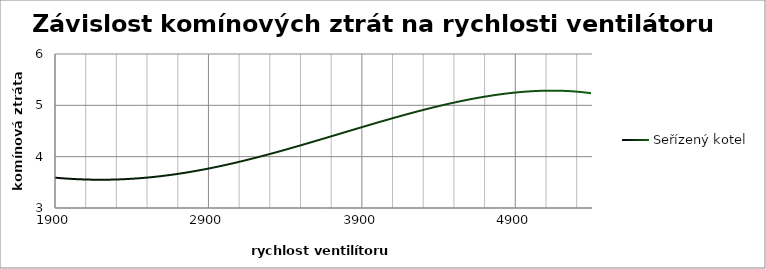
| Category | seřízený |
|---|---|
| 5400.0 | 4.2 |
| 1900.0 | 2.2 |
| 5400.0 | 4.1 |
| 1900.0 | 3.3 |
| 5400.0 | 4.9 |
| 1900.0 | 3.9 |
| 5400.0 | 5.2 |
| 5400.0 | 5.8 |
| 5400.0 | 5.7 |
| 5400.0 | 6 |
| 1900.0 | 4.4 |
| 1900.0 | 3.9 |
| 1900.0 | 3.5 |
| 1900.0 | 3.3 |
| 2400.0 | 3.1 |
| 2900.0 | 3.3 |
| 3400.0 | 3.7 |
| 3900.0 | 4.1 |
| 4400.0 | 4.6 |
| 4900.0 | 5.3 |
| 5400.0 | 5.6 |
| 4600.0 | 5.4 |
| 4100.0 | 5.2 |
| 3700.0 | 4.8 |
| 3200.0 | 4.4 |
| 2600.0 | 4.1 |
| 2100.0 | 3.7 |
| 1900.0 | 4.5 |
| 2400.0 | 3.6 |
| 2900.0 | 3.5 |
| 3400.0 | 3.7 |
| 3900.0 | 4.2 |
| 4400.0 | 4.5 |
| 4900.0 | 5.1 |
| 5400.0 | 5.6 |
| 4600.0 | 5.4 |
| 4100.0 | 5.1 |
| 3700.0 | 4.8 |
| 3200.0 | 4.4 |
| 2600.0 | 3.9 |
| 2100.0 | 3.5 |
| 1900.0 | 3.3 |